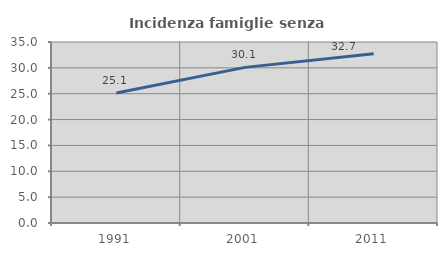
| Category | Incidenza famiglie senza nuclei |
|---|---|
| 1991.0 | 25.124 |
| 2001.0 | 30.092 |
| 2011.0 | 32.729 |